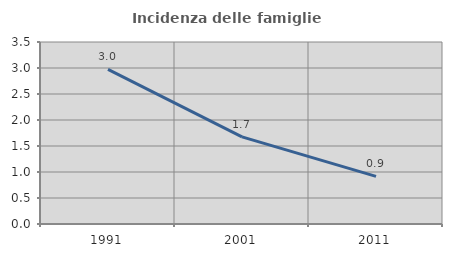
| Category | Incidenza delle famiglie numerose |
|---|---|
| 1991.0 | 2.974 |
| 2001.0 | 1.676 |
| 2011.0 | 0.916 |